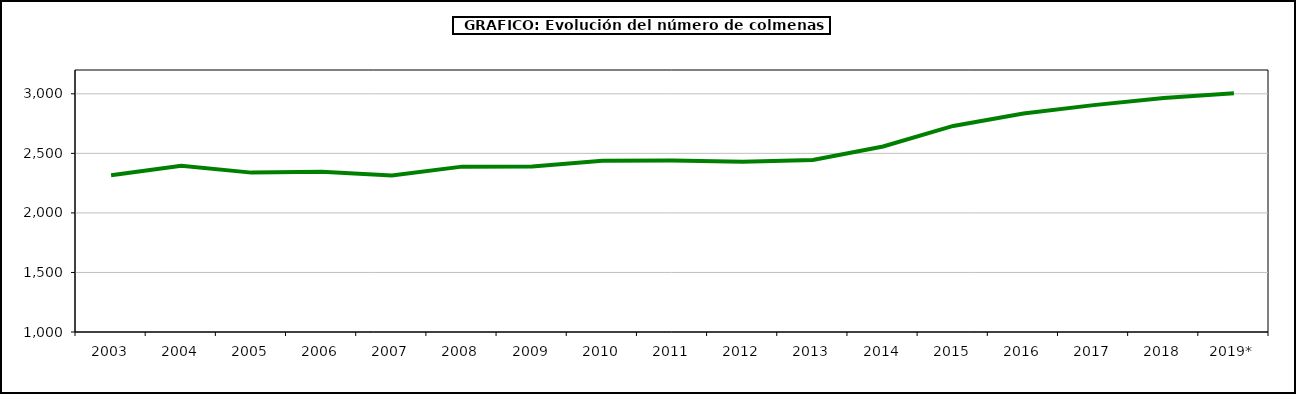
| Category | colmenas |
|---|---|
| 2003 | 2315.982 |
| 2004 | 2396.686 |
| 2005 | 2338.342 |
| 2006 | 2345.368 |
| 2007 | 2313.454 |
| 2008 | 2388.595 |
| 2009 | 2389.999 |
| 2010 | 2438 |
| 2011 | 2439.718 |
| 2012 | 2430.196 |
| 2013 | 2444.097 |
| 2014 | 2557.301 |
| 2015 | 2730.296 |
| 2016 | 2834.514 |
| 2017 | 2904.971 |
| 2018 | 2965.557 |
| 2019* | 3004.638 |